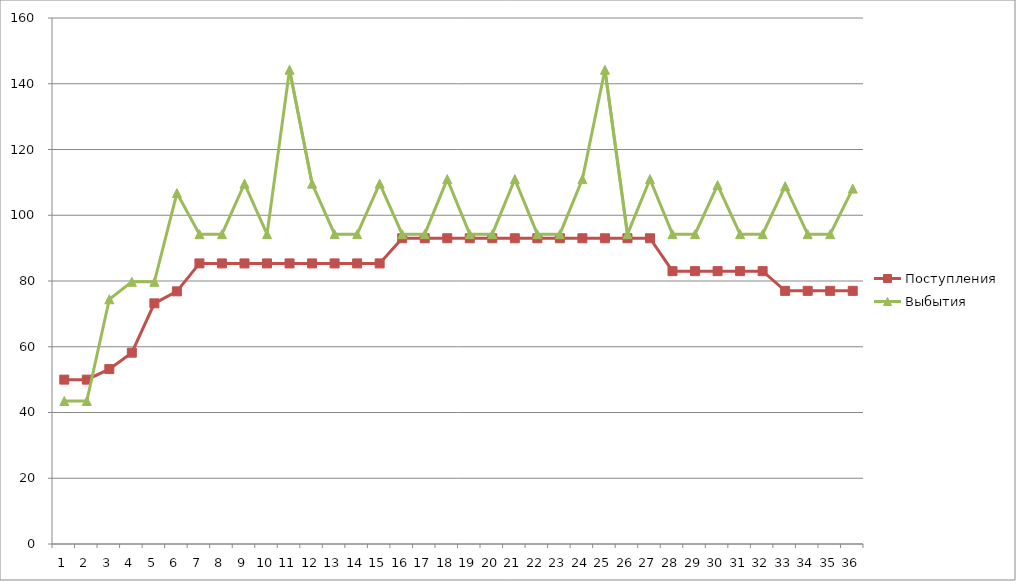
| Category | Поступления | Выбытия |
|---|---|---|
| 0 | 50 | 43.5 |
| 1 | 50 | 43.5 |
| 2 | 53.2 | 74.442 |
| 3 | 58.2 | 79.75 |
| 4 | 73.2 | 79.75 |
| 5 | 76.85 | 106.745 |
| 6 | 85.35 | 94.25 |
| 7 | 85.35 | 94.25 |
| 8 | 85.35 | 109.613 |
| 9 | 85.35 | 94.25 |
| 10 | 85.35 | 144.25 |
| 11 | 85.35 | 109.613 |
| 12 | 85.35 | 94.25 |
| 13 | 85.35 | 94.25 |
| 14 | 85.35 | 109.613 |
| 15 | 93 | 94.25 |
| 16 | 93 | 94.25 |
| 17 | 93 | 110.99 |
| 18 | 93 | 94.25 |
| 19 | 93 | 94.25 |
| 20 | 93 | 110.99 |
| 21 | 93 | 94.25 |
| 22 | 93 | 94.25 |
| 23 | 93 | 110.99 |
| 24 | 93 | 144.25 |
| 25 | 93 | 94.25 |
| 26 | 93 | 110.99 |
| 27 | 83 | 94.25 |
| 28 | 83 | 94.25 |
| 29 | 83 | 109.19 |
| 30 | 83 | 94.25 |
| 31 | 83 | 94.25 |
| 32 | 77 | 108.83 |
| 33 | 77 | 94.25 |
| 34 | 77 | 94.25 |
| 35 | 77 | 108.11 |